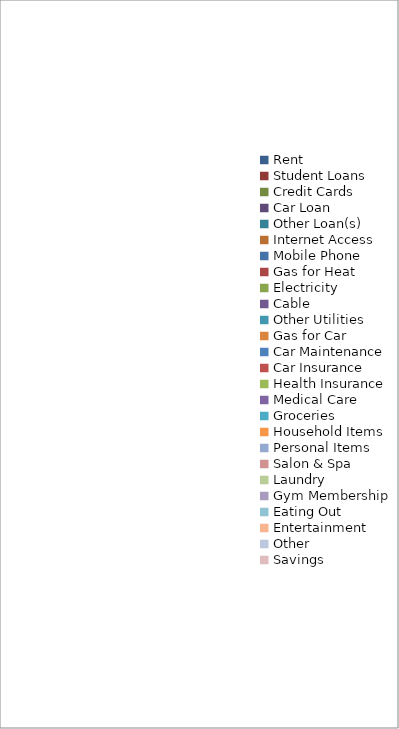
| Category | Series 0 |
|---|---|
| Rent | 0 |
| Student Loans | 0 |
| Credit Cards | 0 |
| Car Loan | 0 |
| Other Loan(s) | 0 |
| Internet Access | 0 |
| Mobile Phone | 0 |
| Gas for Heat | 0 |
| Electricity | 0 |
| Cable | 0 |
| Other Utilities | 0 |
| Gas for Car | 0 |
| Car Maintenance | 0 |
| Car Insurance | 0 |
| Health Insurance | 0 |
| Medical Care | 0 |
| Groceries | 0 |
| Household Items | 0 |
| Personal Items | 0 |
| Salon & Spa | 0 |
| Laundry | 0 |
| Gym Membership | 0 |
| Eating Out | 0 |
| Entertainment | 0 |
| Other | 0 |
| Savings | 0 |